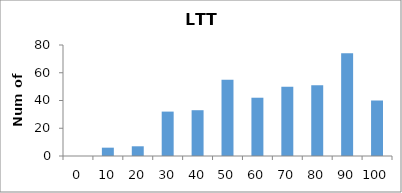
| Category | Series 0 |
|---|---|
| 0.0 | 0 |
| 10.0 | 6 |
| 20.0 | 7 |
| 30.0 | 32 |
| 40.0 | 33 |
| 50.0 | 55 |
| 60.0 | 42 |
| 70.0 | 50 |
| 80.0 | 51 |
| 90.0 | 74 |
| 100.0 | 40 |